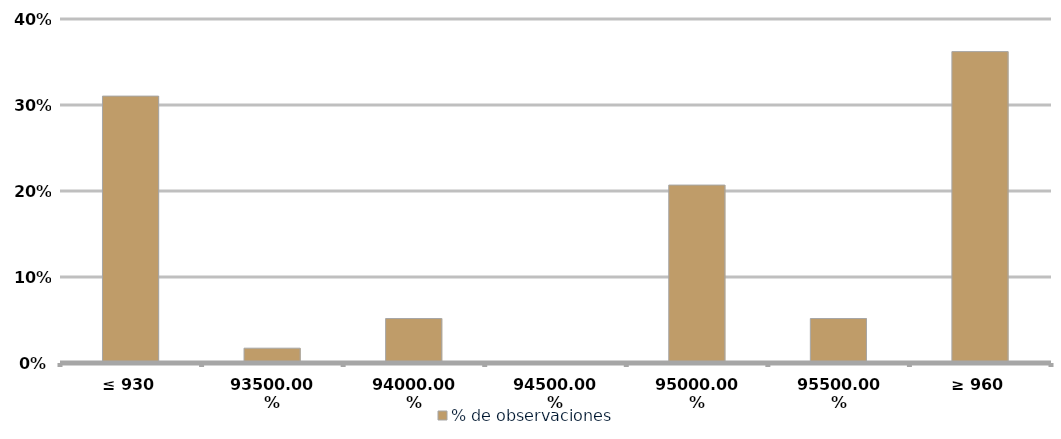
| Category | % de observaciones  |
|---|---|
| ≤ 930 | 0.31 |
| 935 | 0.017 |
| 940 | 0.052 |
| 945 | 0 |
| 950 | 0.207 |
| 955 | 0.052 |
| ≥ 960 | 0.362 |